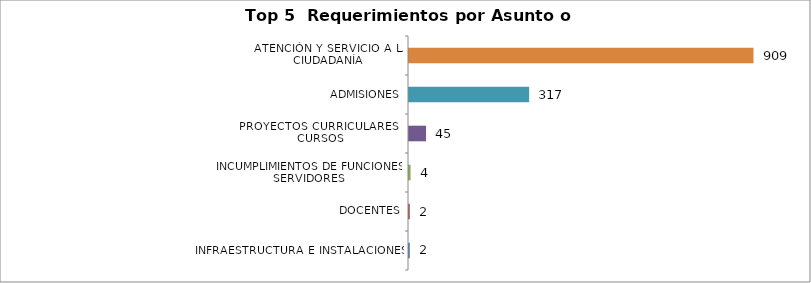
| Category | Total |
|---|---|
| INFRAESTRUCTURA E INSTALACIONES | 2 |
| DOCENTES | 2 |
| INCUMPLIMIENTOS DE FUNCIONES SERVIDORES | 4 |
| PROYECTOS CURRICULARES Y CURSOS | 45 |
| ADMISIONES | 317 |
| ATENCIÓN Y SERVICIO A LA CIUDADANÍA | 909 |